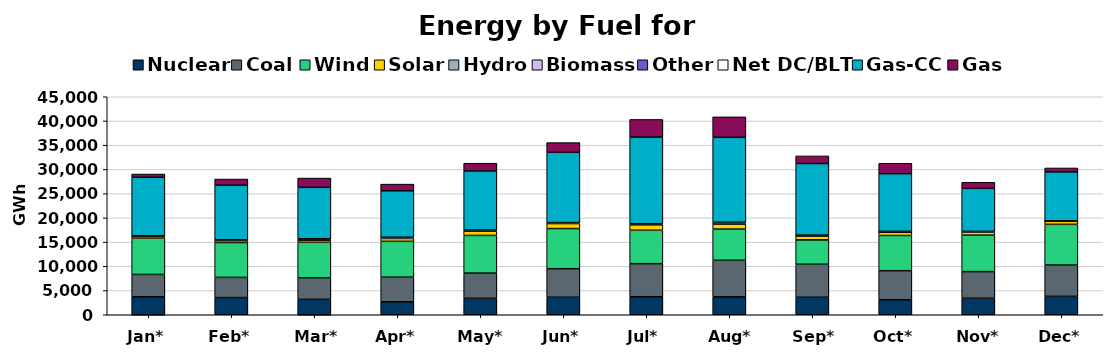
| Category | Nuclear | Coal | Wind | Solar | Hydro | Biomass | Other | Net DC/BLT | Gas-CC | Gas |
|---|---|---|---|---|---|---|---|---|---|---|
| Jan* | 3713 | 4607 | 7487 | 361 | 54 | 25 | -1 | 52 | 12073 | 673 |
| Feb* | 3549 | 4160 | 7198 | 398 | 56 | 35 | 0 | 73 | 11294 | 1250 |
| Mar* | 3189 | 4416 | 7351 | 449 | 96 | 27 | -1 | 157 | 10618 | 1911 |
| Apr* | 2676 | 5084 | 7394 | 595 | 83 | 26 | 0 | 143 | 9593 | 1375 |
| May* | 3387 | 5207 | 7782 | 910 | 77 | 24 | 0 | 90 | 12202 | 1603 |
| Jun* | 3614 | 5893 | 8287 | 1035 | 50 | 25 | 0 | 116 | 14514 | 1997 |
| Jul* | 3717 | 6831 | 6901 | 1144 | 50 | 20 | 0 | 131 | 17881 | 3642 |
| Aug* | 3698 | 7544 | 6443 | 1055 | 53 | 70 | 1 | 225 | 17538 | 4220 |
| Sep* | 3608 | 6819 | 5029 | 816 | 58 | 25 | 1 | 89 | 14773 | 1568 |
| Oct* | 3104 | 5991 | 7273 | 717 | 27 | 25 | 2 | 85 | 11898 | 2143 |
| Nov* | 3401 | 5504 | 7536 | 601 | 17 | 26 | 0 | 124 | 8880 | 1245 |
| Dec* | 3802 | 6458 | 8408 | 668 | 16 | 25 | 1 | 18 | 10099 | 807 |